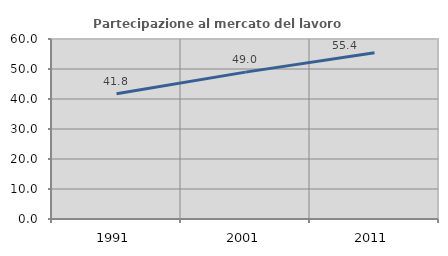
| Category | Partecipazione al mercato del lavoro  femminile |
|---|---|
| 1991.0 | 41.758 |
| 2001.0 | 48.958 |
| 2011.0 | 55.422 |